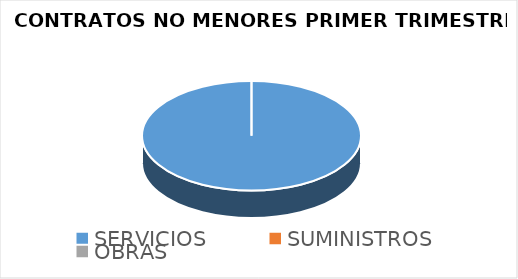
| Category | Series 0 |
|---|---|
| SERVICIOS | 426223.14 |
| SUMINISTROS | 0 |
| OBRAS | 0 |